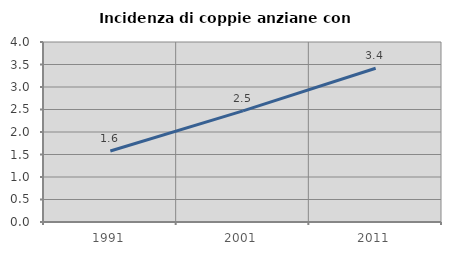
| Category | Incidenza di coppie anziane con figli |
|---|---|
| 1991.0 | 1.579 |
| 2001.0 | 2.471 |
| 2011.0 | 3.416 |